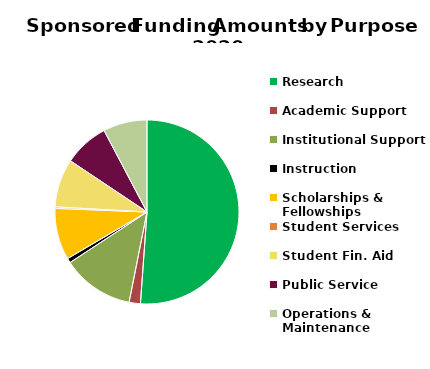
| Category | Series 0 |
|---|---|
| Research | 252983 |
| Academic Support | 9783 |
| Institutional Support | 62474 |
| Instruction | 4001 |
| Scholarships & Fellowships | 44860 |
| Student Services | 1322 |
| Student Fin. Aid | 41948 |
| Public Service | 39110 |
| Operations & Maintenance | 38191 |